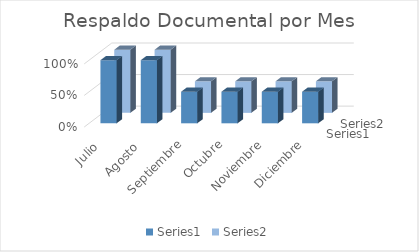
| Category | Series 0 | Series 1 |
|---|---|---|
| Julio  | 1 | 1 |
| Agosto  | 1 | 1 |
| Septiembre | 0.5 | 0.5 |
| Octubre | 0.5 | 0.5 |
| Noviembre | 0.5 | 0.5 |
| Diciembre | 0.5 | 0.5 |